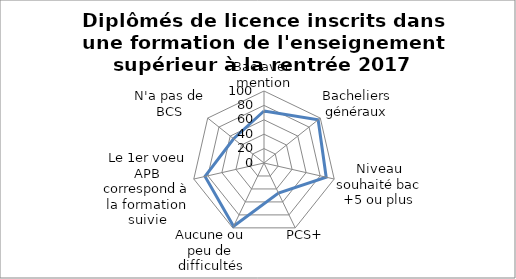
| Category | Diplômés de licence inscrits dans une formation de l'enseignement supérieur à la rentrée 2017 |
|---|---|
| Bac avec mention | 72.2 |
| Bacheliers généraux | 96.2 |
| Niveau souhaité bac +5 ou plus | 88.6 |
| PCS+ | 46.3 |
| Aucune ou peu de difficultés | 97.5 |
| Le 1er voeu APB correspond à la formation suivie | 84 |
| N'a pas de BCS | 54 |